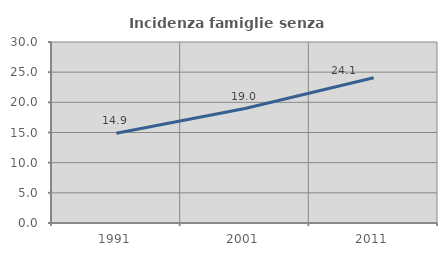
| Category | Incidenza famiglie senza nuclei |
|---|---|
| 1991.0 | 14.874 |
| 2001.0 | 18.968 |
| 2011.0 | 24.074 |